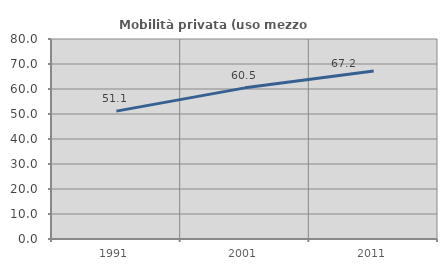
| Category | Mobilità privata (uso mezzo privato) |
|---|---|
| 1991.0 | 51.148 |
| 2001.0 | 60.458 |
| 2011.0 | 67.212 |